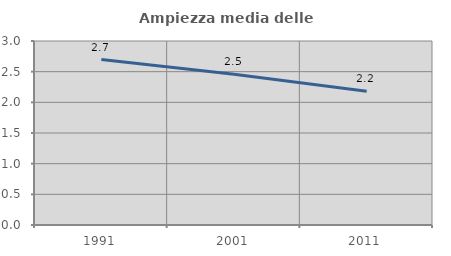
| Category | Ampiezza media delle famiglie |
|---|---|
| 1991.0 | 2.697 |
| 2001.0 | 2.459 |
| 2011.0 | 2.18 |